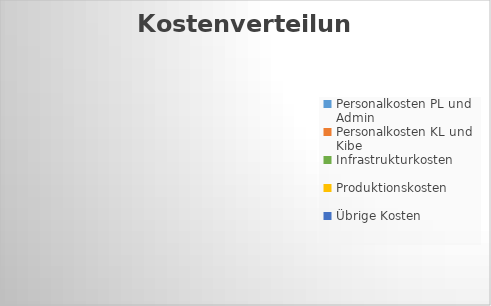
| Category | Series 0 |
|---|---|
| Personalkosten PL und Admin | 0 |
| Personalkosten KL und Kibe | 0 |
| Infrastrukturkosten | 0 |
| Produktionskosten | 0 |
| Übrige Kosten | 0 |